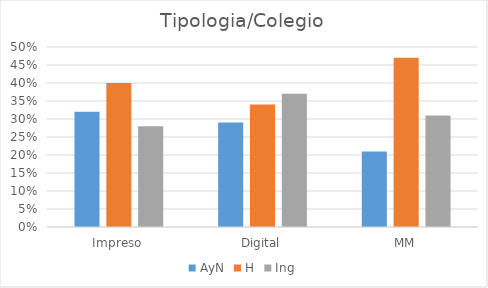
| Category | AyN | H | Ing |
|---|---|---|---|
| Impreso | 0.32 | 0.4 | 0.28 |
| Digital | 0.29 | 0.34 | 0.37 |
| MM | 0.21 | 0.47 | 0.31 |